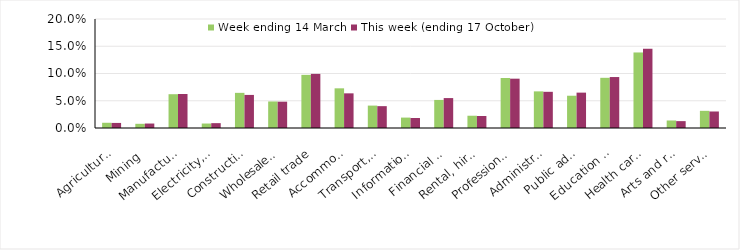
| Category | Week ending 14 March | This week (ending 17 October) |
|---|---|---|
| Agriculture, forestry and fishing | 0.01 | 0.009 |
| Mining | 0.008 | 0.008 |
| Manufacturing | 0.062 | 0.062 |
| Electricity, gas, water and waste services | 0.008 | 0.009 |
| Construction | 0.064 | 0.061 |
| Wholesale trade | 0.049 | 0.048 |
| Retail trade | 0.098 | 0.099 |
| Accommodation and food services | 0.073 | 0.064 |
| Transport, postal and warehousing | 0.041 | 0.04 |
| Information media and telecommunications | 0.019 | 0.018 |
| Financial and insurance services | 0.052 | 0.055 |
| Rental, hiring and real estate services | 0.022 | 0.022 |
| Professional, scientific and technical services | 0.092 | 0.09 |
| Administrative and support services | 0.067 | 0.066 |
| Public administration and safety | 0.059 | 0.065 |
| Education and training | 0.092 | 0.094 |
| Health care and social assistance | 0.139 | 0.145 |
| Arts and recreation services | 0.014 | 0.013 |
| Other services | 0.032 | 0.03 |